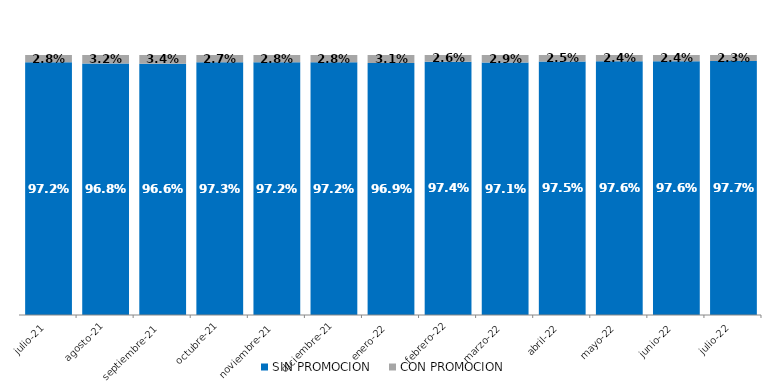
| Category | SIN PROMOCION   | CON PROMOCION   |
|---|---|---|
| 2021-07-01 | 0.972 | 0.028 |
| 2021-08-01 | 0.968 | 0.032 |
| 2021-09-01 | 0.966 | 0.034 |
| 2021-10-01 | 0.973 | 0.027 |
| 2021-11-01 | 0.972 | 0.028 |
| 2021-12-01 | 0.972 | 0.028 |
| 2022-01-01 | 0.969 | 0.031 |
| 2022-02-01 | 0.974 | 0.026 |
| 2022-03-01 | 0.971 | 0.029 |
| 2022-04-01 | 0.975 | 0.025 |
| 2022-05-01 | 0.976 | 0.024 |
| 2022-06-01 | 0.976 | 0.024 |
| 2022-07-01 | 0.977 | 0.023 |